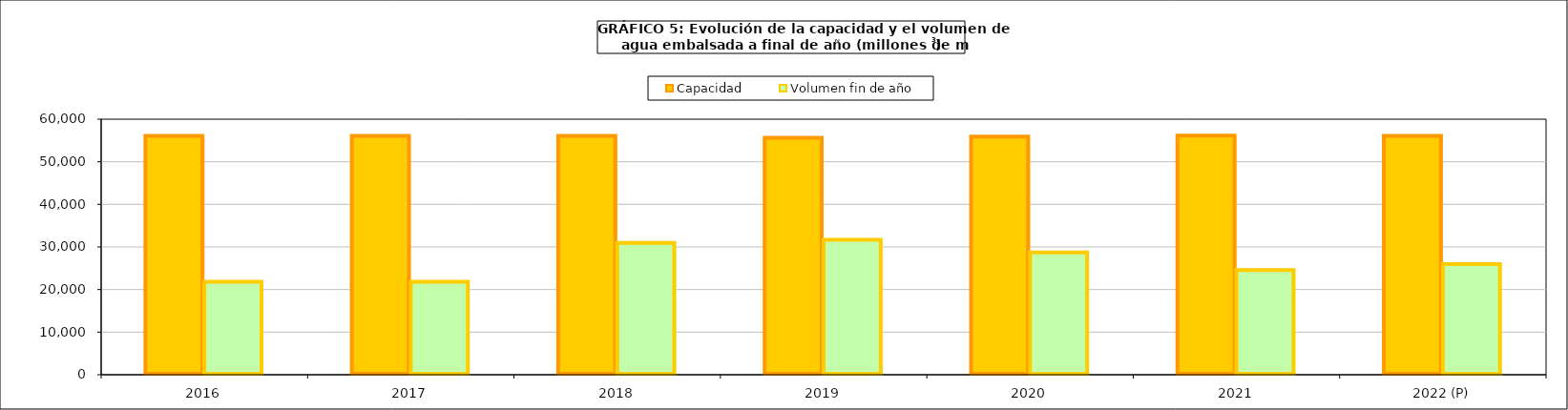
| Category | Capacidad | Volumen fin de año |
|---|---|---|
| 2016 | 56075 | 21832 |
| 2017 | 56074 | 21832 |
| 2018 | 56074 | 30936 |
| 2019 | 55622 | 31678 |
| 2020 | 55899 | 28692 |
| 2021 | 56136 | 24545 |
| 2022 (P) | 56069 | 25977 |